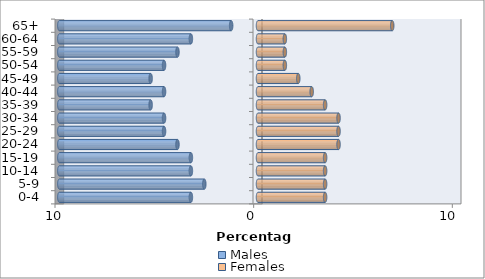
| Category | Males | Females |
|---|---|---|
| 0-4 | -3.378 | 3.378 |
| 5-9 | -2.703 | 3.378 |
| 10-14 | -3.378 | 3.378 |
| 15-19 | -3.378 | 3.378 |
| 20-24 | -4.054 | 4.054 |
| 25-29 | -4.73 | 4.054 |
| 30-34 | -4.73 | 4.054 |
| 35-39 | -5.405 | 3.378 |
| 40-44 | -4.73 | 2.703 |
| 45-49 | -5.405 | 2.027 |
| 50-54 | -4.73 | 1.351 |
| 55-59 | -4.054 | 1.351 |
| 60-64 | -3.378 | 1.351 |
| 65+ | -1.351 | 6.757 |